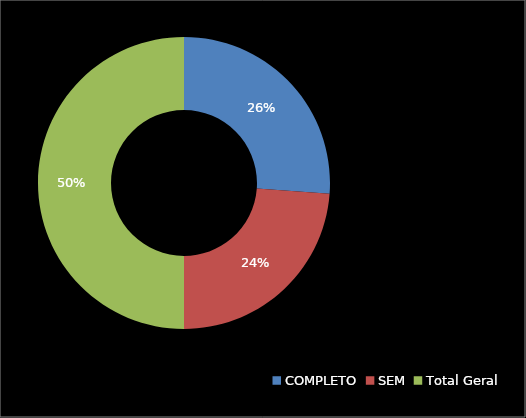
| Category | Contagem de SITUAÇÃO DO GEORREFERENCIAMENTO |
|---|---|
| COMPLETO | 100 |
| SEM | 91 |
| Total Geral | 191 |